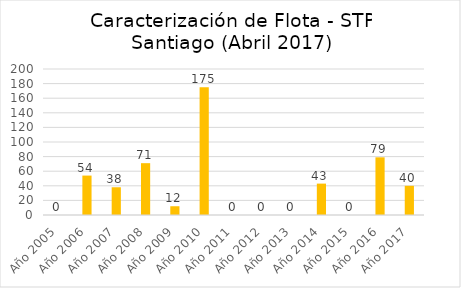
| Category | Series 0 |
|---|---|
| Año 2005 | 0 |
| Año 2006 | 54 |
| Año 2007 | 38 |
| Año 2008 | 71 |
| Año 2009 | 12 |
| Año 2010 | 175 |
| Año 2011 | 0 |
| Año 2012 | 0 |
| Año 2013 | 0 |
| Año 2014 | 43 |
| Año 2015 | 0 |
| Año 2016 | 79 |
| Año 2017 | 40 |